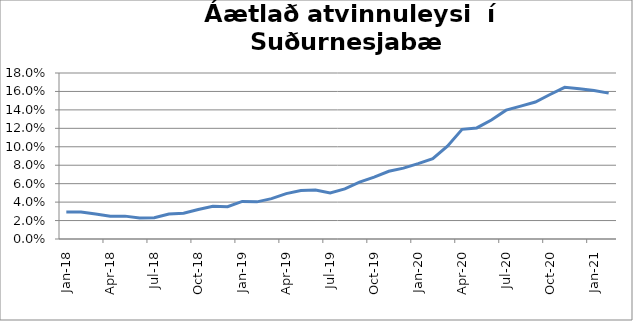
| Category | Series 0 |
|---|---|
| 2018-01-01 | 0.029 |
| 2018-02-01 | 0.029 |
| 2018-03-01 | 0.027 |
| 2018-04-01 | 0.025 |
| 2018-05-01 | 0.025 |
| 2018-06-01 | 0.023 |
| 2018-07-01 | 0.023 |
| 2018-08-01 | 0.027 |
| 2018-09-01 | 0.028 |
| 2018-10-01 | 0.032 |
| 2018-11-01 | 0.036 |
| 2018-12-01 | 0.035 |
| 2019-01-01 | 0.041 |
| 2019-02-01 | 0.04 |
| 2019-03-01 | 0.044 |
| 2019-04-01 | 0.049 |
| 2019-05-01 | 0.053 |
| 2019-06-01 | 0.053 |
| 2019-07-01 | 0.05 |
| 2019-08-01 | 0.054 |
| 2019-09-01 | 0.062 |
| 2019-10-01 | 0.067 |
| 2019-11-01 | 0.073 |
| 2019-12-01 | 0.077 |
| 2020-01-01 | 0.082 |
| 2020-02-01 | 0.087 |
| 2020-03-01 | 0.101 |
| 2020-04-01 | 0.119 |
| 2020-05-01 | 0.12 |
| 2020-06-01 | 0.129 |
| 2020-07-01 | 0.14 |
| 2020-08-01 | 0.144 |
| 2020-09-01 | 0.149 |
| 2020-10-01 | 0.157 |
| 2020-11-01 | 0.164 |
| 2020-12-01 | 0.163 |
| 2021-01-01 | 0.161 |
| 2021-02-01 | 0.158 |